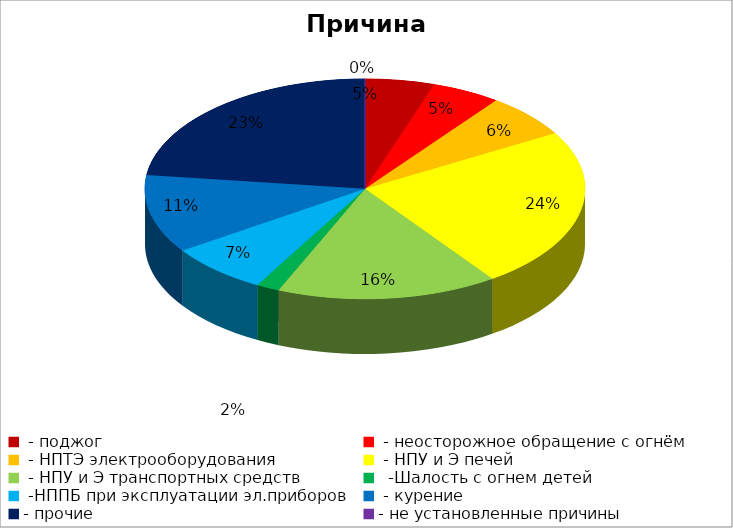
| Category | Причина пожара |
|---|---|
|  - поджог | 15 |
|  - неосторожное обращение с огнём | 15 |
|  - НПТЭ электрооборудования | 19 |
|  - НПУ и Э печей | 70 |
|  - НПУ и Э транспортных средств | 48 |
|   -Шалость с огнем детей | 5 |
|  -НППБ при эксплуатации эл.приборов | 22 |
|  - курение | 34 |
| - прочие | 68 |
| - не установленные причины | 0 |